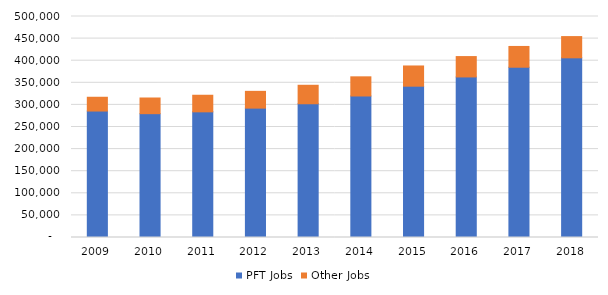
| Category | PFT Jobs | Other Jobs |
|---|---|---|
| 2009.0 | 286112 | 31173 |
| 2010.0 | 280170 | 35448 |
| 2011.0 | 284302 | 37527 |
| 2012.0 | 292712 | 37935 |
| 2013.0 | 302585 | 41811 |
| 2014.0 | 320153 | 43362 |
| 2015.0 | 342345 | 45722 |
| 2016.0 | 363263 | 46087 |
| 2017.0 | 385241 | 47000 |
| 2018.0 | 406520 | 48049 |